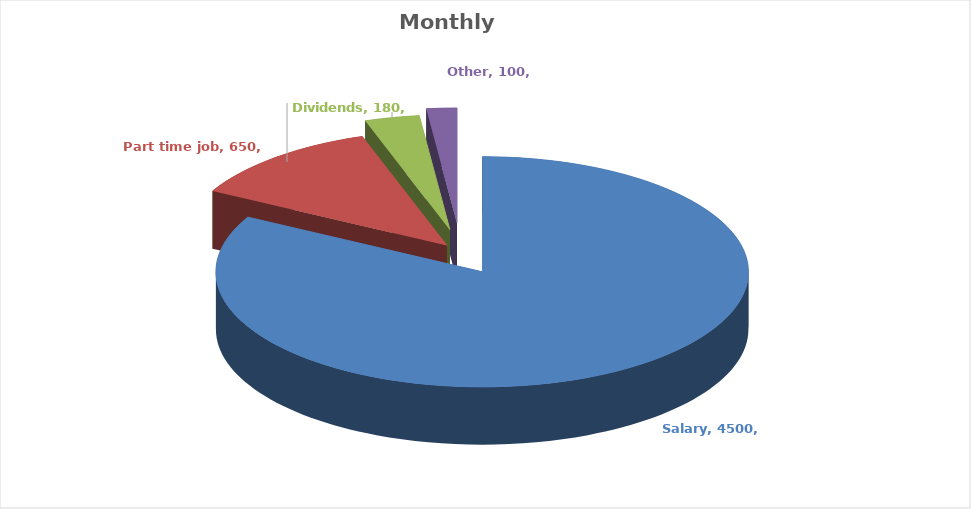
| Category | Series 3 | Series 0 | Series 1 | Series 2 |
|---|---|---|---|---|
| Salary | 4500 |  |  | 4500 |
| Part time job | 650 |  |  | 650 |
| Dividends | 180 |  |  | 180 |
| Other | 100 |  |  | 100 |